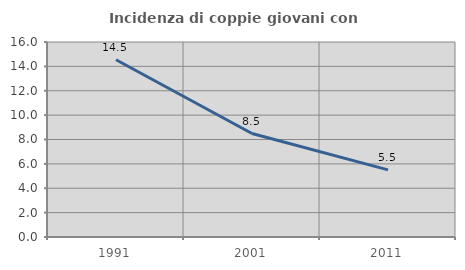
| Category | Incidenza di coppie giovani con figli |
|---|---|
| 1991.0 | 14.541 |
| 2001.0 | 8.49 |
| 2011.0 | 5.508 |